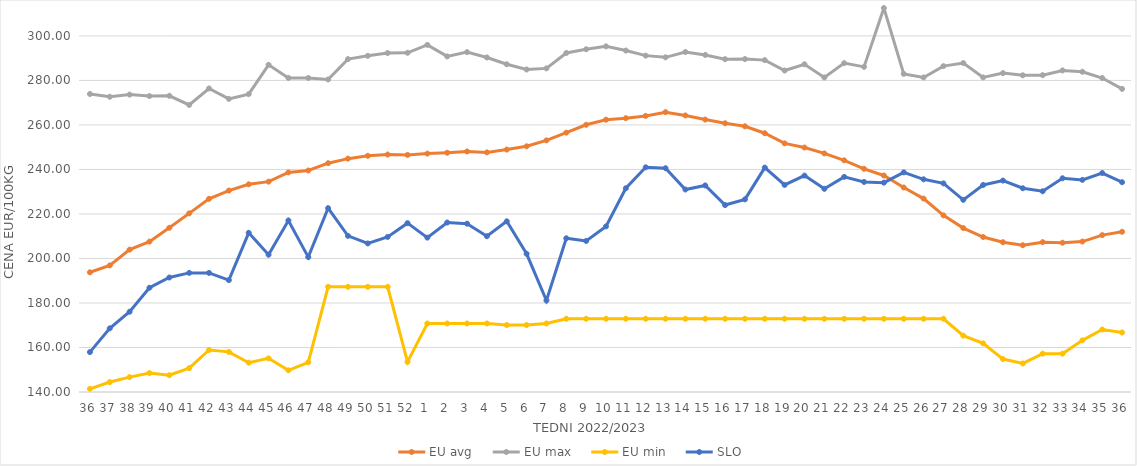
| Category | EU avg | EU max | EU min | SLO |
|---|---|---|---|---|
| 36.0 | 193.792 | 273.91 | 141.41 | 157.93 |
| 37.0 | 196.877 | 272.67 | 144.47 | 168.61 |
| 38.0 | 203.962 | 273.63 | 146.68 | 176.07 |
| 39.0 | 207.574 | 272.98 | 148.499 | 186.86 |
| 40.0 | 213.785 | 273.1 | 147.54 | 191.45 |
| 41.0 | 220.272 | 268.98 | 150.75 | 193.52 |
| 42.0 | 226.803 | 276.39 | 158.87 | 193.52 |
| 43.0 | 230.521 | 271.72 | 158.04 | 190.28 |
| 44.0 | 233.325 | 273.856 | 153.16 | 211.53 |
| 45.0 | 234.517 | 287.021 | 155.13 | 201.69 |
| 46.0 | 238.669 | 281.133 | 149.75 | 217.08 |
| 47.0 | 239.534 | 281.102 | 153.36 | 200.62 |
| 48.0 | 242.81 | 280.434 | 187.26 | 222.61 |
| 49.0 | 244.854 | 289.585 | 187.26 | 210.16 |
| 50.0 | 246.132 | 291.057 | 187.26 | 206.76 |
| 51.0 | 246.705 | 292.307 | 187.26 | 209.69 |
| 52.0 | 246.546 | 292.426 | 153.54 | 215.87 |
| 1.0 | 247.118 | 295.98 | 170.79 | 209.37 |
| 2.0 | 247.516 | 290.8 | 170.79 | 216.15 |
| 3.0 | 248.079 | 292.71 | 170.79 | 215.63 |
| 4.0 | 247.672 | 290.32 | 170.79 | 210 |
| 5.0 | 248.924 | 287.27 | 170.09 | 216.7 |
| 6.0 | 250.4 | 284.92 | 170.09 | 202.1 |
| 7.0 | 253.074 | 285.42 | 170.79 | 181.11 |
| 8.0 | 256.543 | 292.35 | 172.91 | 209.08 |
| 9.0 | 260.066 | 294.02 | 172.91 | 207.87 |
| 10.0 | 262.352 | 295.33 | 172.91 | 214.42 |
| 11.0 | 263.049 | 293.44 | 172.91 | 231.56 |
| 12.0 | 264.068 | 291.15 | 172.91 | 240.97 |
| 13.0 | 265.73 | 290.38 | 172.91 | 240.55 |
| 14.0 | 264.262 | 292.763 | 172.91 | 230.99 |
| 15.0 | 262.411 | 291.46 | 172.91 | 232.82 |
| 16.0 | 260.77 | 289.56 | 172.91 | 224 |
| 17.0 | 259.395 | 289.61 | 172.91 | 226.57 |
| 18.0 | 256.275 | 289.13 | 172.91 | 240.83 |
| 19.0 | 251.716 | 284.45 | 172.91 | 233.05 |
| 20.0 | 249.836 | 287.26 | 172.91 | 237.25 |
| 21.0 | 247.212 | 281.33 | 172.91 | 231.3 |
| 22.0 | 244.103 | 287.77 | 172.91 | 236.67 |
| 23.0 | 240.279 | 286.1 | 172.91 | 234.39 |
| 24.0 | 237.289 | 312.54 | 172.91 | 234.08 |
| 25.0 | 231.895 | 282.95 | 172.91 | 238.69 |
| 26.0 | 226.903 | 281.34 | 172.91 | 235.57 |
| 27.0 | 219.368 | 286.43 | 172.91 | 233.75 |
| 28.0 | 213.659 | 287.8 | 165.32 | 226.35 |
| 29.0 | 209.648 | 281.37 | 161.87 | 233.03 |
| 30.0 | 207.314 | 283.3 | 154.8 | 235 |
| 31.0 | 205.956 | 282.32 | 152.83 | 231.55 |
| 32.0 | 207.325 | 282.36 | 157.23 | 230.2 |
| 33.0 | 207.082 | 284.5 | 157.23 | 236.04 |
| 34.0 | 207.601 | 283.9 | 163.21 | 235.32 |
| 35.0 | 210.492 | 281.09 | 168.085 | 238.39 |
| 36.0 | 211.987 | 276.21 | 166.745 | 234.27 |